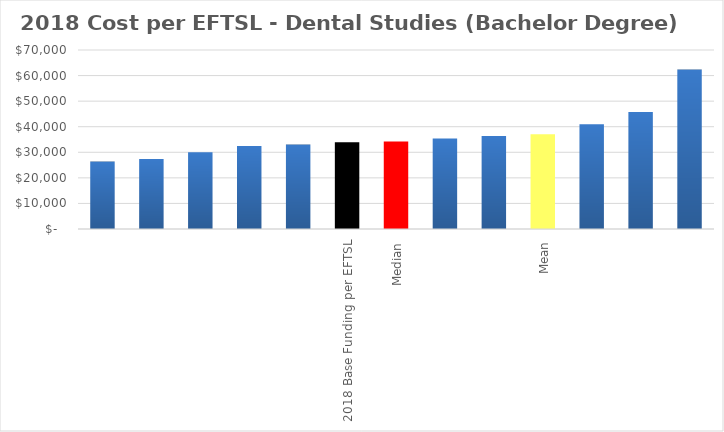
| Category | Series 0 |
|---|---|
|  | 26379.195 |
|  | 27379.735 |
|  | 30015.776 |
|  | 32446.35 |
|  | 33008.53 |
| 2018 Base Funding per EFTSL | 33905 |
| Median | 34210.199 |
|  | 35411.868 |
|  | 36393.211 |
| Mean | 37008.959 |